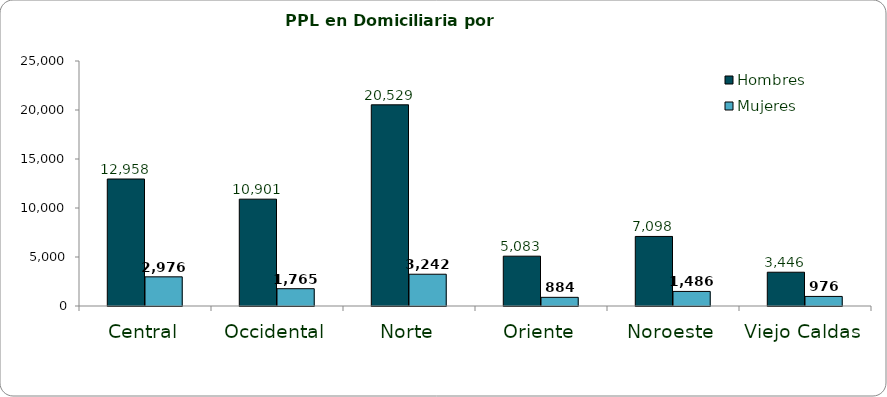
| Category | Hombres | Mujeres |
|---|---|---|
| Central | 12958 | 2976 |
| Occidental | 10901 | 1765 |
| Norte | 20529 | 3242 |
| Oriente | 5083 | 884 |
| Noroeste | 7098 | 1486 |
| Viejo Caldas | 3446 | 976 |